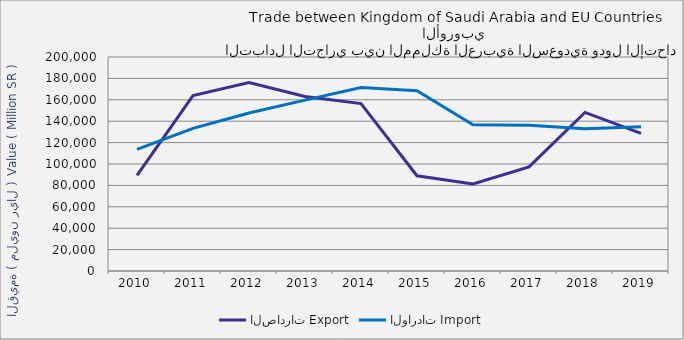
| Category | الصادرات | الواردات |
|---|---|---|
| 2010.0 | 89473272822 | 113673694057 |
| 2011.0 | 163984710171 | 133338217916 |
| 2012.0 | 176214374025 | 147655229181 |
| 2013.0 | 163153758917 | 159668962902 |
| 2014.0 | 156468256094 | 171440173149 |
| 2015.0 | 88997074905 | 168482820598 |
| 2016.0 | 81310614558 | 136611121499 |
| 2017.0 | 97297815008 | 136211429633 |
| 2018.0 | 148179878985 | 132846368857 |
| 2019.0 | 128596712450 | 134816525256 |